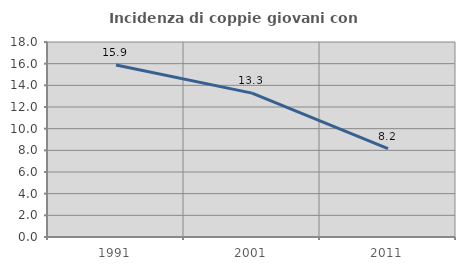
| Category | Incidenza di coppie giovani con figli |
|---|---|
| 1991.0 | 15.884 |
| 2001.0 | 13.278 |
| 2011.0 | 8.155 |